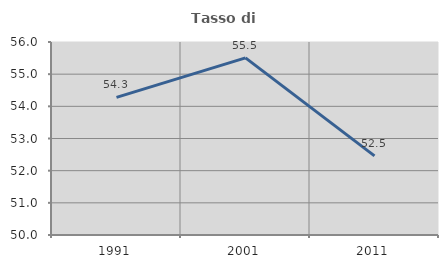
| Category | Tasso di occupazione   |
|---|---|
| 1991.0 | 54.28 |
| 2001.0 | 55.508 |
| 2011.0 | 52.458 |